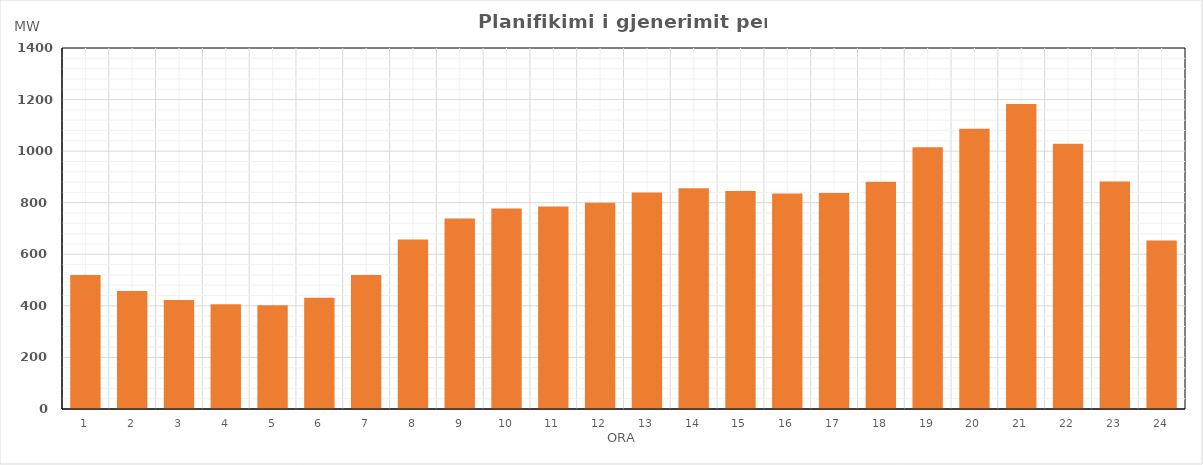
| Category | Max (MW) |
|---|---|
| 0 | 519.79 |
| 1 | 457.33 |
| 2 | 422.63 |
| 3 | 406.37 |
| 4 | 402.48 |
| 5 | 431.75 |
| 6 | 519.5 |
| 7 | 657.33 |
| 8 | 738.62 |
| 9 | 777.63 |
| 10 | 785.8 |
| 11 | 799.61 |
| 12 | 839.89 |
| 13 | 855.66 |
| 14 | 845.56 |
| 15 | 835.97 |
| 16 | 837.85 |
| 17 | 881.73 |
| 18 | 1015.47 |
| 19 | 1086.79 |
| 20 | 1183.24 |
| 21 | 1028.36 |
| 22 | 882.03 |
| 23 | 653.65 |